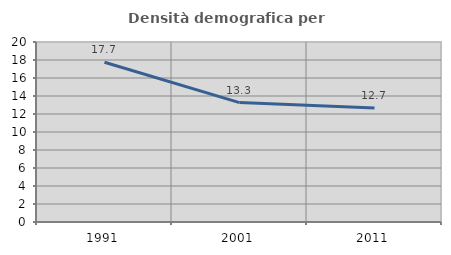
| Category | Densità demografica |
|---|---|
| 1991.0 | 17.749 |
| 2001.0 | 13.264 |
| 2011.0 | 12.664 |